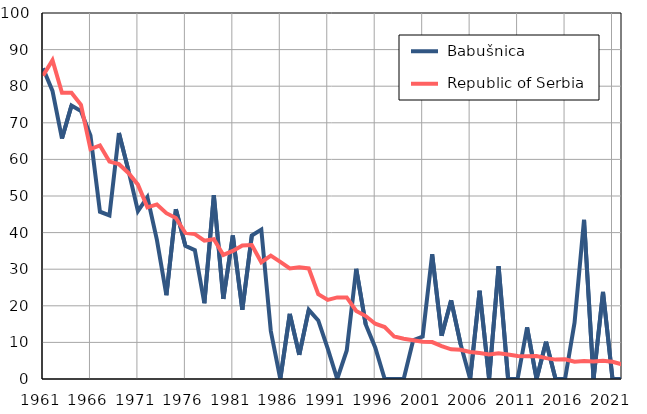
| Category |  Babušnica |  Republic of Serbia |
|---|---|---|
| 1961.0 | 84.9 | 82.9 |
| 1962.0 | 78.7 | 87.1 |
| 1963.0 | 65.7 | 78.2 |
| 1964.0 | 74.7 | 78.2 |
| 1965.0 | 73.2 | 74.9 |
| 1966.0 | 66.5 | 62.8 |
| 1967.0 | 45.7 | 63.8 |
| 1968.0 | 44.7 | 59.4 |
| 1969.0 | 67.2 | 58.7 |
| 1970.0 | 57 | 56.3 |
| 1971.0 | 45.9 | 53.1 |
| 1972.0 | 49.7 | 46.9 |
| 1973.0 | 38 | 47.7 |
| 1974.0 | 22.9 | 45.3 |
| 1975.0 | 46.4 | 44 |
| 1976.0 | 36.4 | 39.9 |
| 1977.0 | 35.2 | 39.6 |
| 1978.0 | 20.7 | 37.8 |
| 1979.0 | 50.2 | 38.2 |
| 1980.0 | 21.9 | 33.9 |
| 1981.0 | 39.2 | 35 |
| 1982.0 | 18.9 | 36.5 |
| 1983.0 | 39.2 | 36.6 |
| 1984.0 | 40.8 | 31.9 |
| 1985.0 | 13.1 | 33.7 |
| 1986.0 | 0 | 32 |
| 1987.0 | 17.8 | 30.2 |
| 1988.0 | 6.6 | 30.5 |
| 1989.0 | 18.9 | 30.2 |
| 1990.0 | 16 | 23.2 |
| 1991.0 | 8.3 | 21.6 |
| 1992.0 | 0 | 22.3 |
| 1993.0 | 7.8 | 22.3 |
| 1994.0 | 30.1 | 18.6 |
| 1995.0 | 14.9 | 17.2 |
| 1996.0 | 8.6 | 15.1 |
| 1997.0 | 0 | 14.2 |
| 1998.0 | 0 | 11.6 |
| 1999.0 | 0 | 11 |
| 2000.0 | 10.6 | 10.6 |
| 2001.0 | 11.6 | 10.2 |
| 2002.0 | 34.1 | 10.1 |
| 2003.0 | 11.8 | 9 |
| 2004.0 | 21.5 | 8.1 |
| 2005.0 | 9.5 | 8 |
| 2006.0 | 0 | 7.4 |
| 2007.0 | 24.1 | 7.1 |
| 2008.0 | 0 | 6.7 |
| 2009.0 | 30.8 | 7 |
| 2010.0 | 0 | 6.7 |
| 2011.0 | 0 | 6.3 |
| 2012.0 | 14.1 | 6.2 |
| 2013.0 | 0 | 6.3 |
| 2014.0 | 10.2 | 5.7 |
| 2015.0 | 0 | 5.3 |
| 2016.0 | 0 | 5.4 |
| 2017.0 | 15.4 | 4.7 |
| 2018.0 | 43.5 | 4.9 |
| 2019.0 | 0 | 4.8 |
| 2020.0 | 23.8 | 5 |
| 2021.0 | 0 | 4.7 |
| 2022.0 | 0 | 4 |